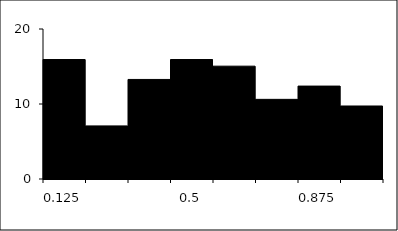
| Category | Series 1 |
|---|---|
| 0.125 | 15.929 |
| 0.25 | 7.08 |
| 0.375 | 13.274 |
| 0.5 | 15.929 |
| 0.625 | 15.044 |
| 0.75 | 10.619 |
| 0.875 | 12.389 |
| 1.0 | 9.735 |